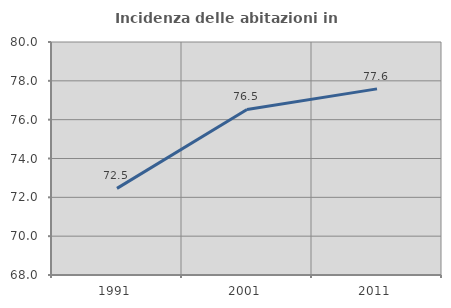
| Category | Incidenza delle abitazioni in proprietà  |
|---|---|
| 1991.0 | 72.46 |
| 2001.0 | 76.524 |
| 2011.0 | 77.586 |